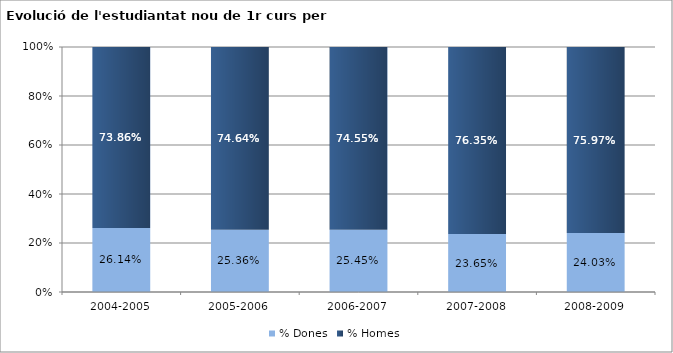
| Category | % Dones | % Homes |
|---|---|---|
| 2004-2005 | 0.261 | 0.739 |
| 2005-2006 | 0.254 | 0.746 |
| 2006-2007 | 0.255 | 0.745 |
| 2007-2008 | 0.237 | 0.763 |
| 2008-2009 | 0.24 | 0.76 |